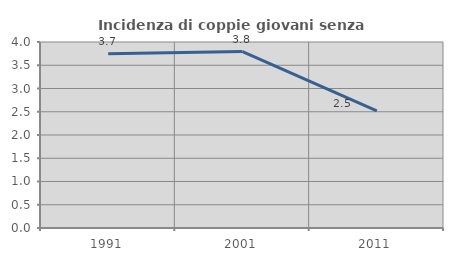
| Category | Incidenza di coppie giovani senza figli |
|---|---|
| 1991.0 | 3.748 |
| 2001.0 | 3.793 |
| 2011.0 | 2.52 |